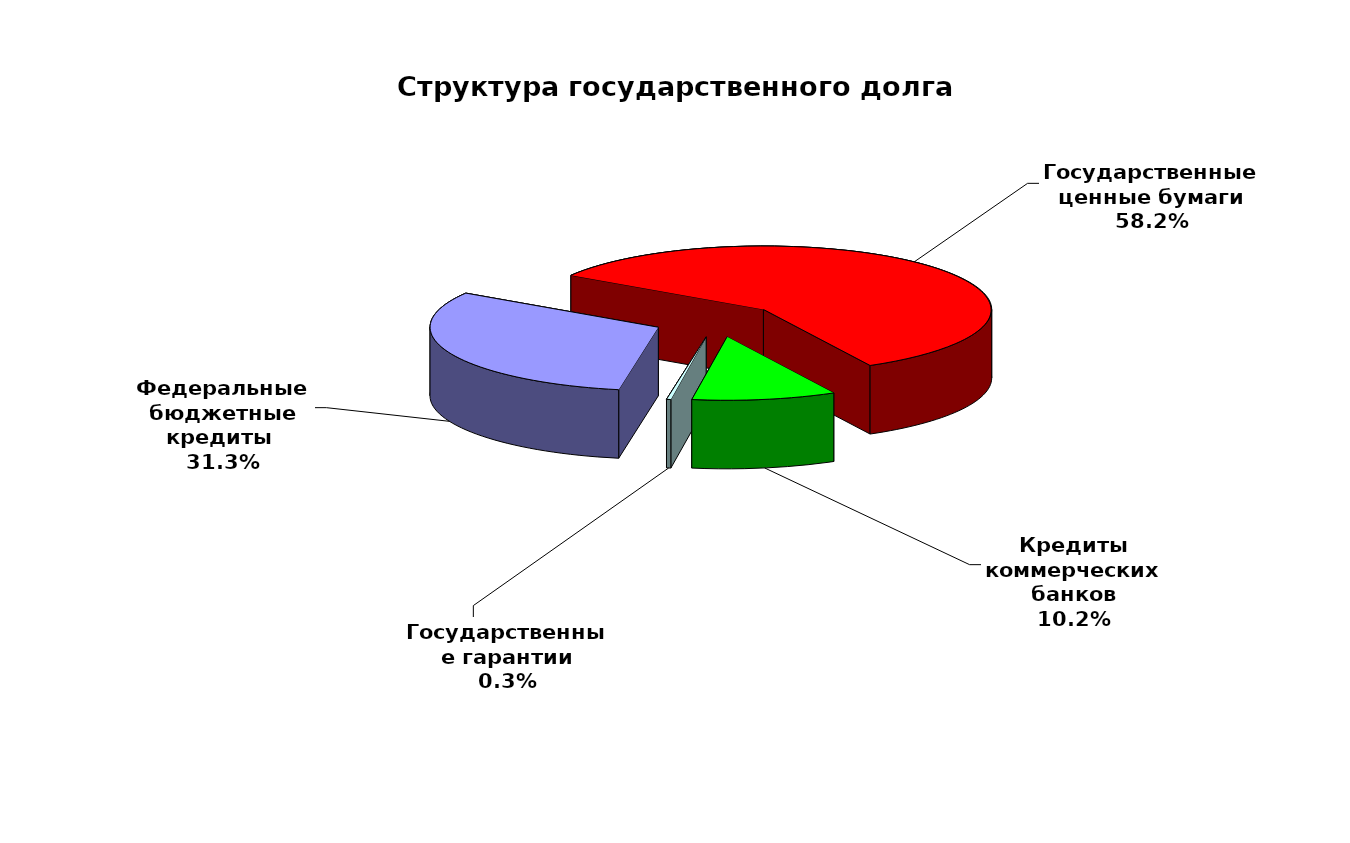
| Category | Series 0 |
|---|---|
| Федеральные бюджетные кредиты  | 18954967.463 |
| Государственные ценные бумаги | 35300000 |
| Кредиты коммерческих банков | 6191177 |
| Государственные гарантии | 186330.02 |